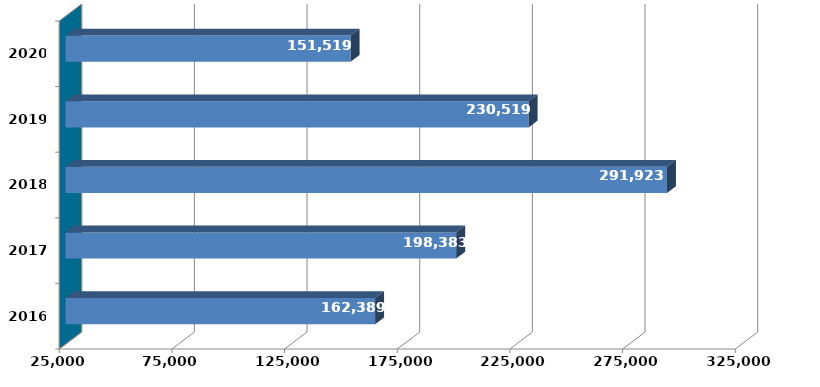
| Category |  Column2  |
|---|---|
| 2016.0 | 162388931 |
| 2017.0 | 198382761 |
| 2018.0 | 291922985 |
| 2019.0 | 230519280 |
| 2020.0 | 151518535 |